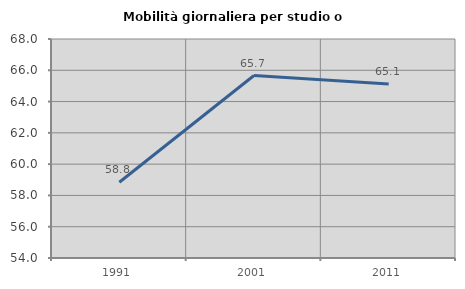
| Category | Mobilità giornaliera per studio o lavoro |
|---|---|
| 1991.0 | 58.841 |
| 2001.0 | 65.666 |
| 2011.0 | 65.123 |